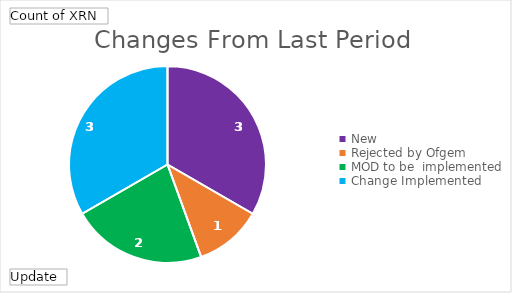
| Category | Total |
|---|---|
| New | 3 |
| Rejected by Ofgem | 1 |
| MOD to be  implemented | 2 |
| Change Implemented | 3 |